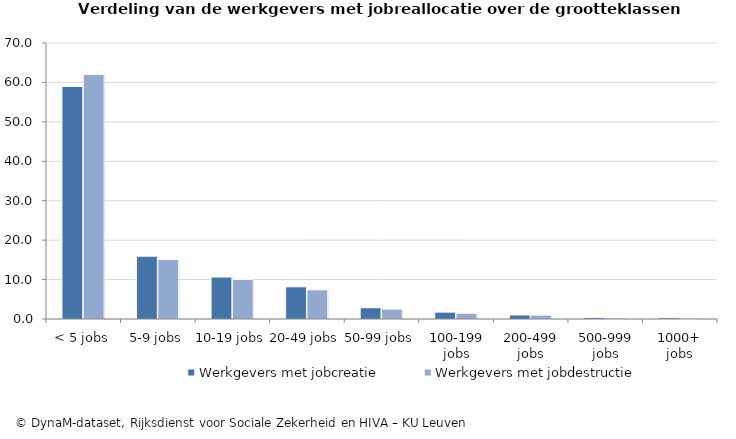
| Category | Werkgevers met jobcreatie | Werkgevers met jobdestructie |
|---|---|---|
| < 5 jobs | 58.979 | 62.036 |
| 5-9 jobs | 15.932 | 15.099 |
| 10-19 jobs | 10.64 | 10.038 |
| 20-49 jobs | 8.156 | 7.396 |
| 50-99 jobs | 2.858 | 2.511 |
| 100-199 jobs | 1.743 | 1.447 |
| 200-499 jobs | 1.021 | 0.975 |
| 500-999 jobs | 0.353 | 0.277 |
| 1000+ jobs | 0.317 | 0.22 |